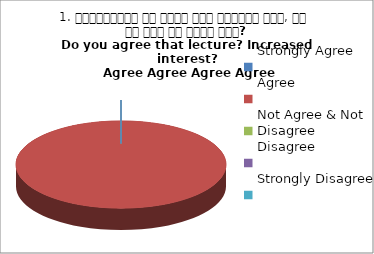
| Category | 1. व्याख्यान से रूचि में वृद्धि हुई, आप इस बात से सहमत हैं?
Do you agree that lecture? Increased interest?
 Agree Agree Agree Agree |
|---|---|
| Strongly Agree | 0 |
| Agree | 4 |
| Not Agree & Not Disagree | 0 |
| Disagree | 0 |
| Strongly Disagree | 0 |